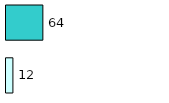
| Category | Series 0 | Series 1 |
|---|---|---|
| 0 | 12 | 64 |